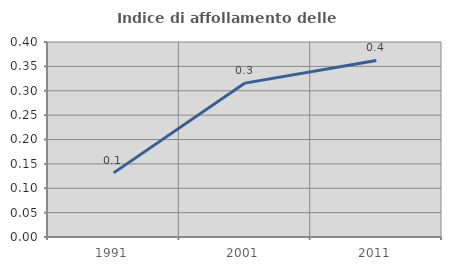
| Category | Indice di affollamento delle abitazioni  |
|---|---|
| 1991.0 | 0.132 |
| 2001.0 | 0.316 |
| 2011.0 | 0.362 |